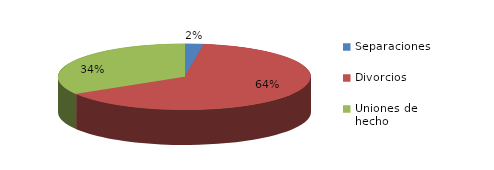
| Category | Series 0 |
|---|---|
| Separaciones | 88 |
| Divorcios | 2357 |
| Uniones de hecho | 1244 |